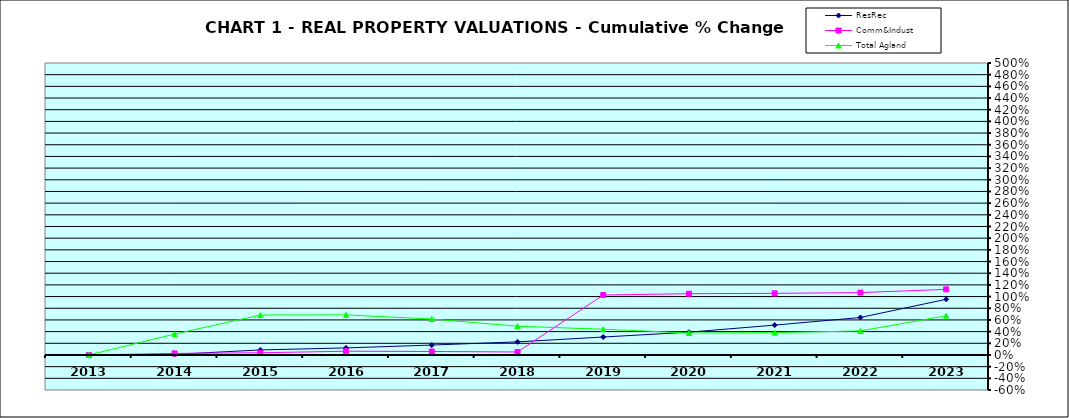
| Category | ResRec | Comm&Indust | Total Agland |
|---|---|---|---|
| 2013.0 | 0 | 0 | 0 |
| 2014.0 | 0.01 | 0.026 | 0.358 |
| 2015.0 | 0.086 | 0.038 | 0.684 |
| 2016.0 | 0.121 | 0.064 | 0.686 |
| 2017.0 | 0.17 | 0.059 | 0.616 |
| 2018.0 | 0.224 | 0.051 | 0.492 |
| 2019.0 | 0.307 | 1.026 | 0.44 |
| 2020.0 | 0.39 | 1.049 | 0.376 |
| 2021.0 | 0.511 | 1.055 | 0.383 |
| 2022.0 | 0.642 | 1.068 | 0.412 |
| 2023.0 | 0.953 | 1.124 | 0.672 |